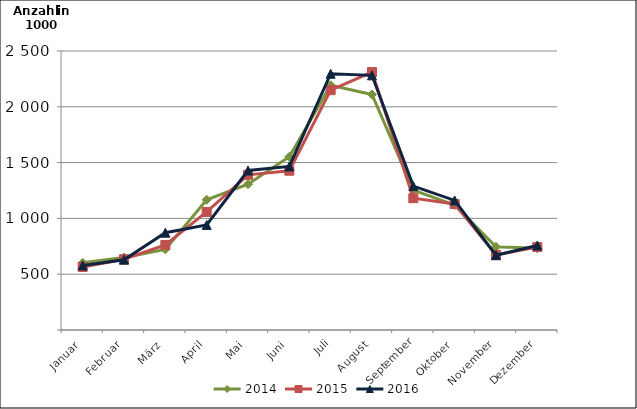
| Category | 2014 | 2015 | 2016 |
|---|---|---|---|
| Januar | 601.946 | 564.707 | 578.669 |
| Februar | 649.815 | 634.326 | 629.84 |
| März | 722.579 | 761.478 | 871.799 |
| April | 1166.592 | 1057.691 | 941.395 |
| Mai | 1306.515 | 1390.361 | 1428.994 |
| Juni | 1552.722 | 1427.202 | 1465.871 |
| Juli | 2193.232 | 2148.876 | 2296.074 |
| August | 2110.418 | 2311.123 | 2281.92 |
| September | 1253.526 | 1181.026 | 1289.414 |
| Oktober | 1119.269 | 1128.909 | 1161.073 |
| November | 745.384 | 672.352 | 669.913 |
| Dezember | 731.588 | 743.18 | 757.3 |